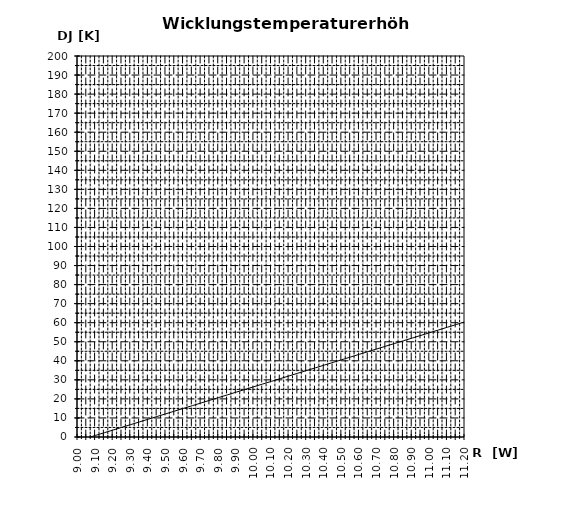
| Category | DJ : [K] |
|---|---|
| 9.0 | -2 |
| 9.05 | -0.581 |
| 9.100000000000001 | 0.839 |
| 9.150000000000002 | 2.258 |
| 9.200000000000003 | 3.678 |
| 9.250000000000004 | 5.097 |
| 9.300000000000004 | 6.517 |
| 9.350000000000005 | 7.936 |
| 9.400000000000006 | 9.356 |
| 9.450000000000006 | 10.775 |
| 9.500000000000007 | 12.194 |
| 9.550000000000008 | 13.614 |
| 9.600000000000009 | 15.033 |
| 9.65000000000001 | 16.453 |
| 9.70000000000001 | 17.872 |
| 9.75000000000001 | 19.292 |
| 9.800000000000011 | 20.711 |
| 9.850000000000012 | 22.131 |
| 9.900000000000013 | 23.55 |
| 9.950000000000014 | 24.969 |
| 10.000000000000014 | 26.389 |
| 10.050000000000015 | 27.808 |
| 10.100000000000016 | 29.228 |
| 10.150000000000016 | 30.647 |
| 10.200000000000017 | 32.067 |
| 10.250000000000018 | 33.486 |
| 10.300000000000018 | 34.906 |
| 10.35000000000002 | 36.325 |
| 10.40000000000002 | 37.744 |
| 10.45000000000002 | 39.164 |
| 10.500000000000021 | 40.583 |
| 10.550000000000022 | 42.003 |
| 10.600000000000023 | 43.422 |
| 10.650000000000023 | 44.842 |
| 10.700000000000024 | 46.261 |
| 10.750000000000025 | 47.681 |
| 10.800000000000026 | 49.1 |
| 10.850000000000026 | 50.519 |
| 10.900000000000027 | 51.939 |
| 10.950000000000028 | 53.358 |
| 11.000000000000028 | 54.778 |
| 11.05000000000003 | 56.197 |
| 11.10000000000003 | 57.617 |
| 11.15000000000003 | 59.036 |
| 11.200000000000031 | 60.456 |